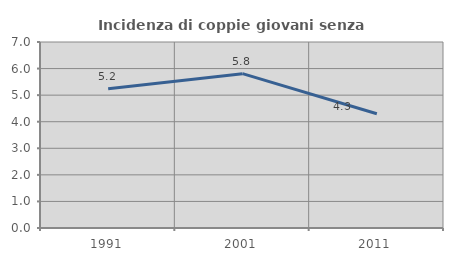
| Category | Incidenza di coppie giovani senza figli |
|---|---|
| 1991.0 | 5.238 |
| 2001.0 | 5.808 |
| 2011.0 | 4.301 |